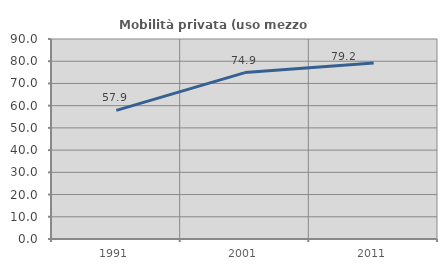
| Category | Mobilità privata (uso mezzo privato) |
|---|---|
| 1991.0 | 57.866 |
| 2001.0 | 74.882 |
| 2011.0 | 79.19 |